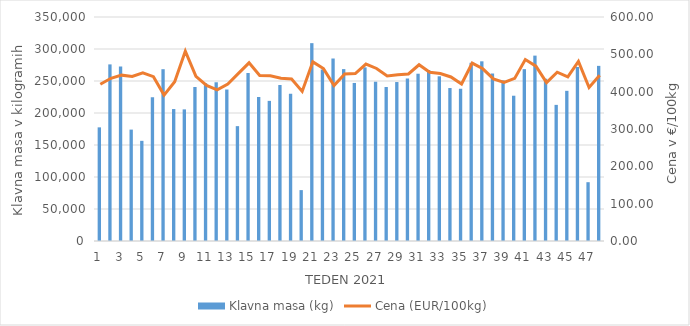
| Category | Klavna masa (kg) |
|---|---|
| 1.0 | 177573 |
| 2.0 | 275951 |
| 3.0 | 272797 |
| 4.0 | 174056 |
| 5.0 | 156508 |
| 6.0 | 224595 |
| 7.0 | 268436 |
| 8.0 | 206193 |
| 9.0 | 205669 |
| 10.0 | 240592 |
| 11.0 | 246325 |
| 12.0 | 248020 |
| 13.0 | 236703 |
| 14.0 | 179478 |
| 15.0 | 262544 |
| 16.0 | 225033 |
| 17.0 | 218950 |
| 18.0 | 243711 |
| 19.0 | 229955 |
| 20.0 | 79521 |
| 21.0 | 309134 |
| 22.0 | 268074 |
| 23.0 | 285151 |
| 24.0 | 268579 |
| 25.0 | 246944 |
| 26.0 | 271319 |
| 27.0 | 248858 |
| 28.0 | 240609 |
| 29.0 | 248383 |
| 30.0 | 253894 |
| 31.0 | 261374 |
| 32.0 | 267142 |
| 33.0 | 257352 |
| 34.0 | 239018 |
| 35.0 | 238034 |
| 36.0 | 278443 |
| 37.0 | 280772 |
| 38.0 | 261791 |
| 39.0 | 250972 |
| 40.0 | 226992 |
| 41.0 | 268523 |
| 42.0 | 289650 |
| 43.0 | 253458 |
| 44.0 | 212689 |
| 45.0 | 234635 |
| 46.0 | 272042 |
| 47.0 | 91884 |
| 48.0 | 273642 |